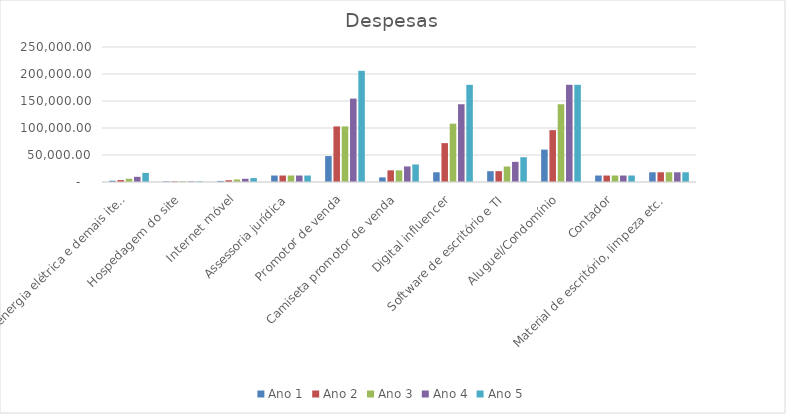
| Category | Ano 1 | Ano 2 | Ano 3 | Ano 4 | Ano 5 |
|---|---|---|---|---|---|
| Telefonia, energia elétrica e demais itens de telecomunicações | 2400 | 3600 | 6000 | 9600 | 16800 |
| Hospedagem do site | 1200 | 1200 | 1200 | 1200 | 1200 |
| Internet móvel | 1979.64 | 3299.4 | 4619.16 | 5938.92 | 7258.68 |
| Assessoria jurídica | 12000 | 12000 | 12000 | 12000 | 12000 |
| Promotor de venda | 47970 | 102960 | 102960 | 154440 | 205920 |
| Camiseta promotor de venda | 8580 | 21600 | 21600 | 28800 | 32400 |
| Digital influencer | 18000 | 72000 | 108000 | 144000 | 180000 |
| Software de escritório e TI | 20000 | 20076 | 28680 | 37284 | 45888 |
| Aluguel/Condomínio | 60000 | 96000 | 144000 | 180000 | 180000 |
| Contador | 12000 | 12000 | 12000 | 12000 | 12000 |
| Material de escritório, limpeza etc. | 18000 | 18000 | 18000 | 18000 | 18000 |